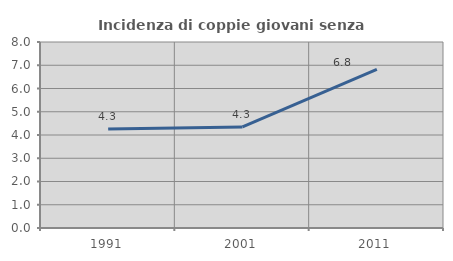
| Category | Incidenza di coppie giovani senza figli |
|---|---|
| 1991.0 | 4.255 |
| 2001.0 | 4.348 |
| 2011.0 | 6.818 |